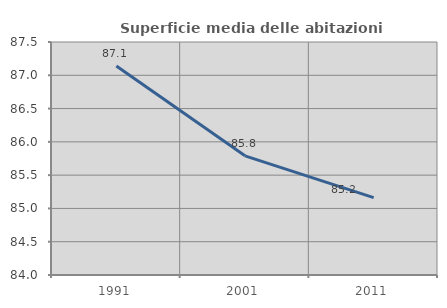
| Category | Superficie media delle abitazioni occupate |
|---|---|
| 1991.0 | 87.141 |
| 2001.0 | 85.79 |
| 2011.0 | 85.162 |